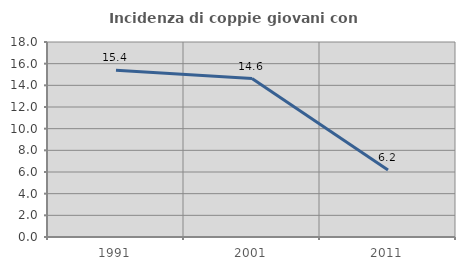
| Category | Incidenza di coppie giovani con figli |
|---|---|
| 1991.0 | 15.385 |
| 2001.0 | 14.623 |
| 2011.0 | 6.195 |